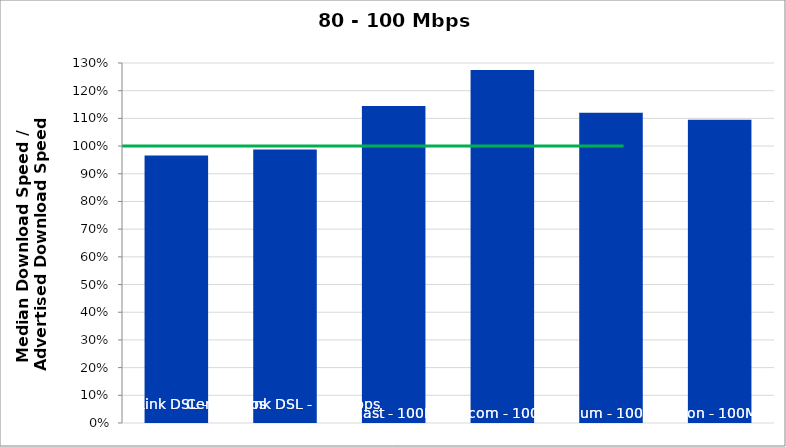
| Category | Series 0 |
|---|---|
| CenturyLink DSL - 80Mbps | 0.966 |
| CenturyLink DSL - 100Mbps | 0.988 |
| Comcast - 100Mbps | 1.145 |
| Mediacom - 100Mbps | 1.275 |
| Optimum - 100Mbps | 1.121 |
| Verizon - 100Mbps | 1.095 |